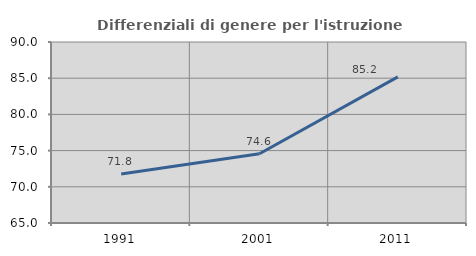
| Category | Differenziali di genere per l'istruzione superiore |
|---|---|
| 1991.0 | 71.78 |
| 2001.0 | 74.566 |
| 2011.0 | 85.178 |